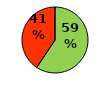
| Category | Series 0 |
|---|---|
|  | 0.593 |
|  | 0.407 |